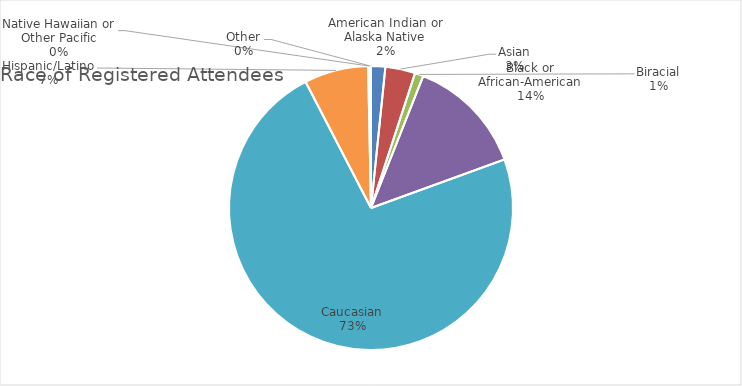
| Category | Series 0 |
|---|---|
| American Indian or Alaska Native | 10 |
| Asian | 21 |
| Biracial | 6 |
| Black or African-American | 83 |
| Caucasian | 450 |
| Hispanic/Latino | 45 |
| Native Hawaiian or Other Pacific | 1 |
| Other | 1 |